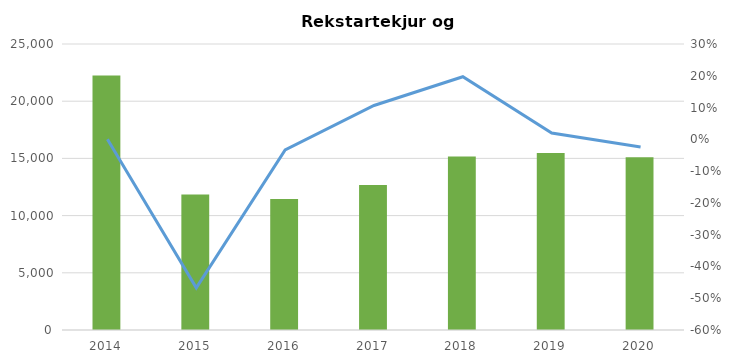
| Category | Rekstrartekjur |
|---|---|
| 2014.0 | 22248000000 |
| 2015.0 | 11848000000 |
| 2016.0 | 11455000000 |
| 2017.0 | 12674000000 |
| 2018.0 | 15172000000 |
| 2019.0 | 15470000000 |
| 2020.0 | 15092000000 |